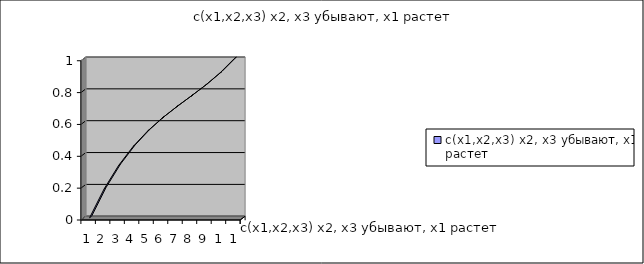
| Category | c(x1,x2,x3) x2, x3 убывают, x1 растет |
|---|---|
| 0 | 0 |
| 1 | 0.181 |
| 2 | 0.328 |
| 3 | 0.447 |
| 4 | 0.544 |
| 5 | 0.625 |
| 6 | 0.696 |
| 7 | 0.763 |
| 8 | 0.832 |
| 9 | 0.909 |
| 10 | 1 |